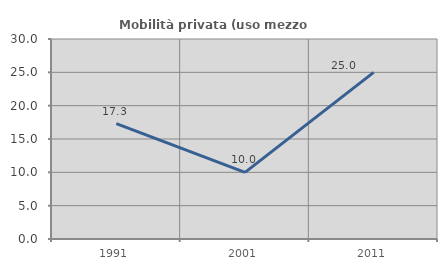
| Category | Mobilità privata (uso mezzo privato) |
|---|---|
| 1991.0 | 17.308 |
| 2001.0 | 10 |
| 2011.0 | 25 |